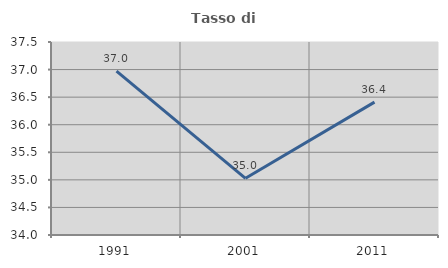
| Category | Tasso di occupazione   |
|---|---|
| 1991.0 | 36.97 |
| 2001.0 | 35.029 |
| 2011.0 | 36.409 |